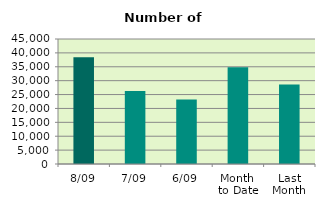
| Category | Series 0 |
|---|---|
| 8/09 | 38386 |
| 7/09 | 26302 |
| 6/09 | 23192 |
| Month 
to Date | 34795.333 |
| Last
Month | 28637.636 |